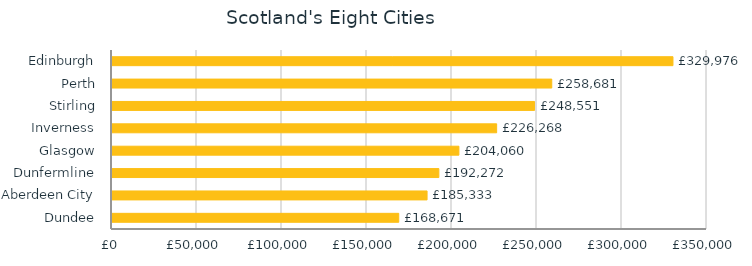
| Category | Series 0 |
|---|---|
| Dundee | 168670.897 |
| Aberdeen City | 185332.519 |
| Dunfermline | 192271.89 |
| Glasgow | 204060.497 |
| Inverness | 226267.523 |
| Stirling | 248551.333 |
| Perth | 258680.931 |
| Edinburgh | 329976.187 |